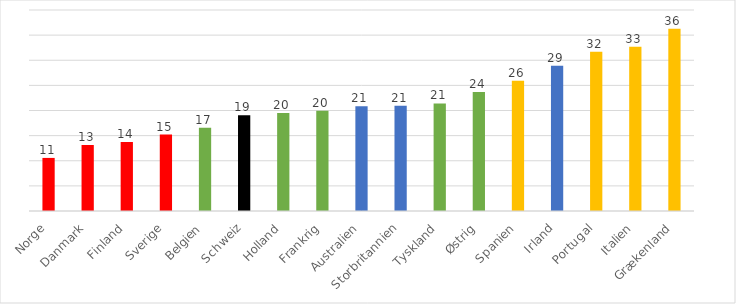
| Category | Series 0 |
|---|---|
| Norge | 10.563 |
| Danmark | 13.125 |
| Finland | 13.711 |
| Sverige | 15.216 |
| Belgien | 16.557 |
| Schweiz | 19.069 |
| Holland | 19.502 |
| Frankrig | 19.961 |
| Australien | 20.868 |
| Storbritannien | 20.926 |
| Tyskland | 21.403 |
| Østrig | 23.675 |
| Spanien | 25.939 |
| Irland | 28.922 |
| Portugal | 31.675 |
| Italien | 32.675 |
| Grækenland | 36.258 |